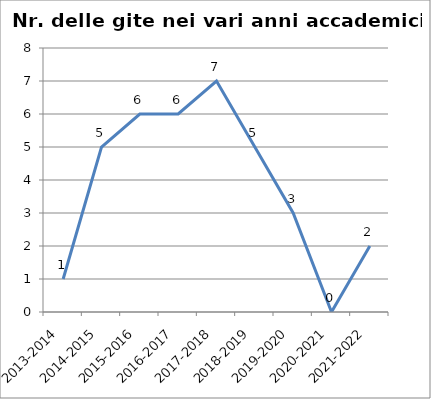
| Category | Nr. Gite Svolte |
|---|---|
| 2013-2014 | 1 |
| 2014-2015 | 5 |
| 2015-2016 | 6 |
| 2016-2017 | 6 |
| 2017-2018 | 7 |
| 2018-2019 | 5 |
| 2019-2020 | 3 |
| 2020-2021 | 0 |
| 2021-2022 | 2 |